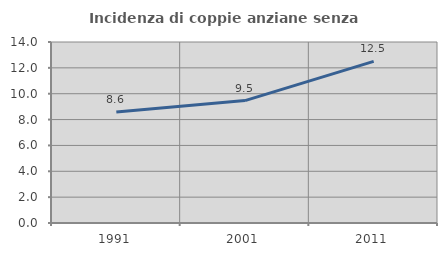
| Category | Incidenza di coppie anziane senza figli  |
|---|---|
| 1991.0 | 8.589 |
| 2001.0 | 9.467 |
| 2011.0 | 12.5 |